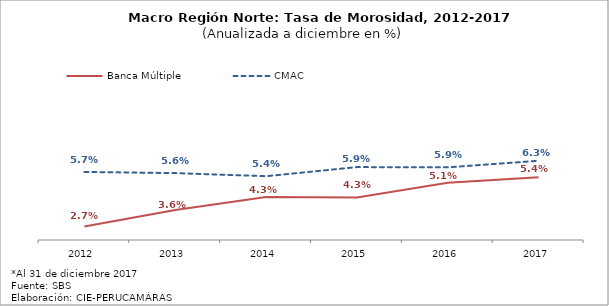
| Category | Banca Múltiple | CMAC |
|---|---|---|
| 2012.0 | 0.027 | 0.057 |
| 2013.0 | 0.036 | 0.056 |
| 2014.0 | 0.043 | 0.054 |
| 2015.0 | 0.043 | 0.059 |
| 2016.0 | 0.051 | 0.059 |
| 2017.0 | 0.054 | 0.063 |